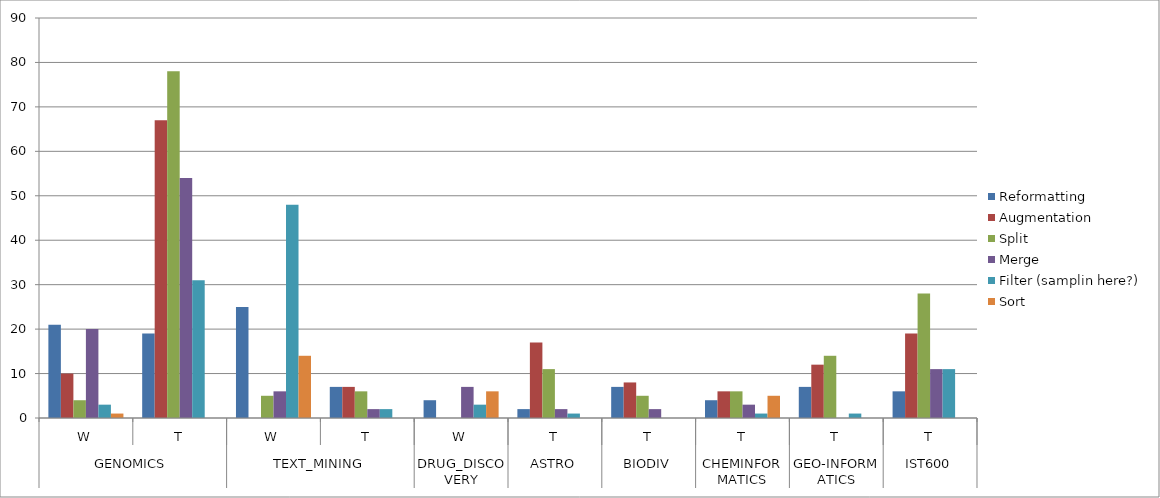
| Category | Reformatting | Augmentation | Split | Merge | Filter (samplin here?) | Sort |
|---|---|---|---|---|---|---|
| 0 | 21 | 10 | 4 | 20 | 3 | 1 |
| 1 | 19 | 67 | 78 | 54 | 31 | 0 |
| 2 | 25 | 0 | 5 | 6 | 48 | 14 |
| 3 | 7 | 7 | 6 | 2 | 2 | 0 |
| 4 | 4 | 0 | 0 | 7 | 3 | 6 |
| 5 | 2 | 17 | 11 | 2 | 1 | 0 |
| 6 | 7 | 8 | 5 | 2 | 0 | 0 |
| 7 | 4 | 6 | 6 | 3 | 1 | 5 |
| 8 | 7 | 12 | 14 | 0 | 1 | 0 |
| 9 | 6 | 19 | 28 | 11 | 11 | 0 |